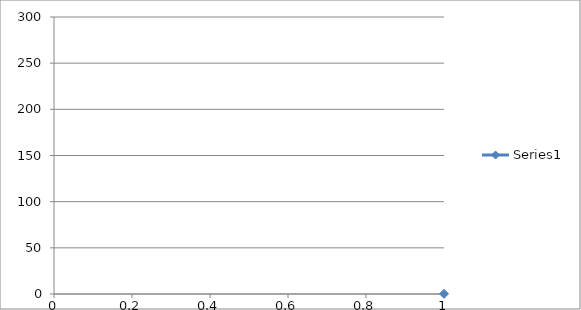
| Category | Series 0 |
|---|---|
| 0 | 0.195 |
| 1 | 0.232 |
| 2 | 0.256 |
| 3 | 0.274 |
| 4 | 0.323 |
| 5 | 0.358 |
| 6 | 0.4 |
| 7 | 0.441 |
| 8 | 0.503 |
| 9 | 0.531 |
| 10 | 0.586 |
| 11 | 0.668 |
| 12 | 0.755 |
| 13 | 0.815 |
| 14 | 0.883 |
| 15 | 0.993 |
| 16 | 1.146 |
| 17 | 1.29 |
| 18 | 1.461 |
| 19 | 1.665 |
| 20 | 1.905 |
| 21 | 2.196 |
| 22 | 2.527 |
| 23 | 2.943 |
| 24 | 3.454 |
| 25 | 4.114 |
| 26 | 4.876 |
| 27 | 6.347 |
| 28 | 7.76 |
| 29 | 9.374 |
| 30 | 12.115 |
| 31 | 13.363 |
| 32 | 14.612 |
| 33 | 16.029 |
| 34 | 17.662 |
| 35 | 19.313 |
| 36 | 21.243 |
| 37 | 23.935 |
| 38 | 26.557 |
| 39 | 29.373 |
| 40 | 32.45 |
| 41 | 36.483 |
| 42 | 40.559 |
| 43 | 44.615 |
| 44 | 50.107 |
| 45 | 55.625 |
| 46 | 61.661 |
| 47 | 68.23 |
| 48 | 75.697 |
| 49 | 83.376 |
| 50 | 91.442 |
| 51 | 99.976 |
| 52 | 108.975 |
| 53 | 118.625 |
| 54 | 127.648 |
| 55 | 137.816 |
| 56 | 147.21 |
| 57 | 156.626 |
| 58 | 165.65 |
| 59 | 174.845 |
| 60 | 182.976 |
| 61 | 190.82 |
| 62 | 197.547 |
| 63 | 204.279 |
| 64 | 210.358 |
| 65 | 215.216 |
| 66 | 219.798 |
| 67 | 224.021 |
| 68 | 227.481 |
| 69 | 230.067 |
| 70 | 232.628 |
| 71 | 234.158 |
| 72 | 235.767 |
| 73 | 237.076 |
| 74 | 237.536 |
| 75 | 238.072 |
| 76 | 238.6 |
| 77 | 238.85 |
| 78 | 239.035 |
| 79 | 239.106 |
| 80 | 239.129 |
| 81 | 239.076 |
| 82 | 238.96 |
| 83 | 238.786 |
| 84 | 238.484 |
| 85 | 238.14 |
| 86 | 237.625 |
| 87 | 236.31 |
| 88 | 235.064 |
| 89 | 233.642 |
| 90 | 231.999 |
| 91 | 229.323 |
| 92 | 226.465 |
| 93 | 222.818 |
| 94 | 218.991 |
| 95 | 214.537 |
| 96 | 208.875 |
| 97 | 202.986 |
| 98 | 196.452 |
| 99 | 189.058 |
| 100 | 181.292 |
| 101 | 172.958 |
| 102 | 164.629 |
| 103 | 155.396 |
| 104 | 145.919 |
| 105 | 136.466 |
| 106 | 126.747 |
| 107 | 117.44 |
| 108 | 107.665 |
| 109 | 99.021 |
| 110 | 90.537 |
| 111 | 82.164 |
| 112 | 74.289 |
| 113 | 67.257 |
| 114 | 61.093 |
| 115 | 55.067 |
| 116 | 49.605 |
| 117 | 44.728 |
| 118 | 40.449 |
| 119 | 36.071 |
| 120 | 32.727 |
| 121 | 29.555 |
| 122 | 26.591 |
| 123 | 23.807 |
| 124 | 21.962 |
| 125 | 19.501 |
| 126 | 17.907 |
| 127 | 16.295 |
| 128 | 14.738 |
| 129 | 13.383 |
| 130 | 12.167 |
| 131 | 9.772 |
| 132 | 8.144 |
| 133 | 6.73 |
| 134 | 5.924 |
| 135 | 5.098 |
| 136 | 4.357 |
| 137 | 3.73 |
| 138 | 3.212 |
| 139 | 2.784 |
| 140 | 2.437 |
| 141 | 2.156 |
| 142 | 1.926 |
| 143 | 1.714 |
| 144 | 1.536 |
| 145 | 1.385 |
| 146 | 1.25 |
| 147 | 1.148 |
| 148 | 1.074 |
| 149 | 0.989 |
| 150 | 0.916 |
| 151 | 0.87 |
| 152 | 0.797 |
| 153 | 0.755 |
| 154 | 0.707 |
| 155 | 0.685 |
| 156 | 0.651 |
| 157 | 0.631 |
| 158 | 0.61 |
| 159 | 0.579 |
| 160 | 0.548 |